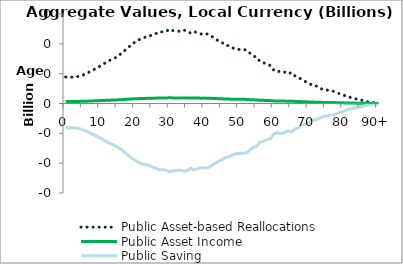
| Category | Public Asset-based Reallocations | Public Asset Income | Public Saving |
|---|---|---|---|
| 0 | 88.857 | 6.831 | -82.026 |
|  | 88.378 | 6.794 | -81.584 |
| 2 | 88.075 | 6.771 | -81.304 |
| 3 | 88.928 | 6.837 | -82.091 |
| 4 | 91.831 | 7.06 | -84.771 |
| 5 | 95.365 | 7.332 | -88.034 |
| 6 | 100.306 | 7.711 | -92.594 |
| 7 | 107.091 | 8.233 | -98.858 |
| 8 | 113.013 | 8.688 | -104.325 |
| 9 | 119.536 | 9.19 | -110.346 |
| 10 | 126.325 | 9.712 | -116.613 |
| 11 | 133.474 | 10.261 | -123.213 |
| 12 | 140.367 | 10.791 | -129.576 |
| 13 | 146.429 | 11.257 | -135.172 |
| 14 | 151.366 | 11.637 | -139.729 |
| 15 | 158.791 | 12.208 | -146.583 |
| 16 | 167.508 | 12.878 | -154.63 |
| 17 | 177.7 | 13.661 | -164.039 |
| 18 | 187.738 | 14.433 | -173.305 |
| 19 | 198.106 | 15.23 | -182.875 |
| 20 | 206.24 | 15.856 | -190.385 |
| 21 | 213.189 | 16.39 | -196.799 |
| 22 | 219.507 | 16.875 | -202.632 |
| 23 | 222.336 | 17.093 | -205.243 |
| 24 | 224.839 | 17.285 | -207.554 |
| 25 | 230.966 | 17.756 | -213.209 |
| 26 | 234.645 | 18.039 | -216.605 |
| 27 | 240.938 | 18.523 | -222.415 |
| 28 | 239.707 | 18.428 | -221.279 |
| 29 | 242.906 | 18.674 | -224.232 |
| 30 | 249.265 | 19.163 | -230.102 |
| 31 | 243.88 | 18.749 | -225.131 |
| 32 | 243.32 | 18.706 | -224.614 |
| 33 | 241.286 | 18.55 | -222.736 |
| 34 | 245.746 | 18.893 | -226.853 |
| 35 | 243.224 | 18.699 | -224.526 |
| 36 | 235.418 | 18.099 | -217.32 |
| 37 | 240.911 | 18.521 | -222.39 |
| 38 | 236.504 | 18.182 | -218.322 |
| 39 | 232.971 | 17.911 | -215.06 |
| 40 | 234.6 | 18.036 | -216.564 |
| 41 | 232.385 | 17.866 | -214.52 |
| 42 | 225.933 | 17.369 | -208.563 |
| 43 | 216.862 | 16.672 | -200.19 |
| 44 | 209.741 | 16.125 | -193.616 |
| 45 | 204.439 | 15.717 | -188.722 |
| 46 | 194.907 | 14.984 | -179.923 |
| 47 | 193.725 | 14.893 | -178.832 |
| 48 | 186.525 | 14.34 | -172.185 |
| 49 | 182.563 | 14.035 | -168.527 |
| 50 | 181.013 | 13.916 | -167.097 |
| 51 | 180.749 | 13.896 | -166.853 |
| 52 | 179.574 | 13.805 | -165.768 |
| 53 | 169.116 | 13.001 | -156.115 |
| 54 | 159.42 | 12.256 | -147.164 |
| 55 | 155.31 | 11.94 | -143.37 |
| 56 | 139.88 | 10.754 | -129.126 |
| 57 | 136.44 | 10.489 | -125.95 |
| 58 | 130.702 | 10.048 | -120.654 |
| 59 | 127.02 | 9.765 | -117.255 |
| 60 | 110.144 | 8.468 | -101.676 |
| 61 | 106.525 | 8.19 | -98.335 |
| 62 | 108.905 | 8.372 | -100.532 |
| 63 | 105.242 | 8.091 | -97.151 |
| 64 | 99.292 | 7.633 | -91.659 |
| 65 | 103.532 | 7.959 | -95.573 |
| 66 | 92.779 | 7.133 | -85.646 |
| 67 | 88.107 | 6.774 | -81.334 |
| 68 | 79.479 | 6.11 | -73.369 |
| 69 | 73.744 | 5.669 | -68.075 |
| 70 | 68.721 | 5.283 | -63.437 |
| 71 | 60.425 | 4.645 | -55.779 |
| 72 | 59.439 | 4.57 | -54.869 |
| 73 | 53.712 | 4.129 | -49.583 |
| 74 | 46.784 | 3.597 | -43.187 |
| 75 | 46.396 | 3.567 | -42.829 |
| 76 | 42.12 | 3.238 | -38.881 |
| 77 | 41.189 | 3.167 | -38.022 |
| 78 | 36.886 | 2.836 | -34.05 |
| 79 | 31.849 | 2.449 | -29.401 |
| 80 | 28.444 | 2.187 | -26.257 |
| 81 | 22.456 | 1.726 | -20.73 |
| 82 | 20.361 | 1.565 | -18.796 |
| 83 | 17.548 | 1.349 | -16.199 |
| 84 | 14.086 | 1.083 | -13.003 |
| 85 | 11.708 | 0.9 | -10.808 |
| 86 | 8.185 | 0.629 | -7.556 |
| 87 | 5.418 | 0.417 | -5.001 |
| 88 | 3.783 | 0.291 | -3.492 |
| 89 | 2.357 | 0.181 | -2.176 |
| 90+ | 6.168 | 0.474 | -5.694 |